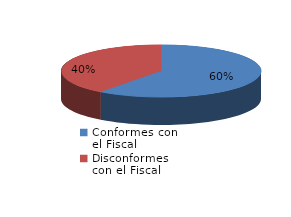
| Category | Series 0 |
|---|---|
| 0 | 1395 |
| 1 | 920 |